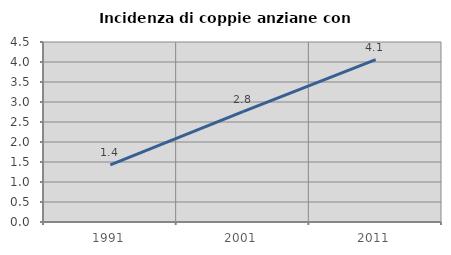
| Category | Incidenza di coppie anziane con figli |
|---|---|
| 1991.0 | 1.429 |
| 2001.0 | 2.762 |
| 2011.0 | 4.058 |